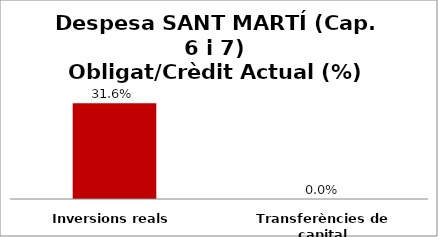
| Category | Series 0 |
|---|---|
| Inversions reals | 0.316 |
| Transferències de capital | 0 |